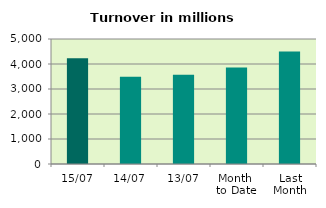
| Category | Series 0 |
|---|---|
| 15/07 | 4231.958 |
| 14/07 | 3494.581 |
| 13/07 | 3565.634 |
| Month 
to Date | 3857.404 |
| Last
Month | 4502.251 |